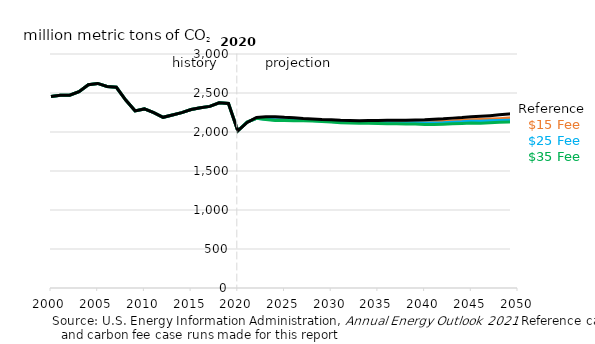
| Category | $15 Fee case | $25 Fee case | $35 Fee case | Reference |
|---|---|---|---|---|
| 2000.0 | 2454.069 | 2454.069 | 2454.069 | 2454.069 |
| 2001.0 | 2472.441 | 2472.441 | 2472.441 | 2472.441 |
| 2002.0 | 2470.83 | 2470.83 | 2470.83 | 2470.83 |
| 2003.0 | 2516.745 | 2516.745 | 2516.745 | 2516.745 |
| 2004.0 | 2606.407 | 2606.407 | 2606.407 | 2606.407 |
| 2005.0 | 2622.849 | 2622.849 | 2622.849 | 2622.849 |
| 2006.0 | 2584.14 | 2584.14 | 2584.14 | 2584.14 |
| 2007.0 | 2573.196 | 2573.196 | 2573.196 | 2573.196 |
| 2008.0 | 2409.604 | 2409.604 | 2409.604 | 2409.604 |
| 2009.0 | 2271.146 | 2271.146 | 2271.146 | 2271.146 |
| 2010.0 | 2295.762 | 2295.762 | 2295.762 | 2295.762 |
| 2011.0 | 2247.259 | 2247.259 | 2247.259 | 2247.259 |
| 2012.0 | 2188.587 | 2188.587 | 2188.587 | 2188.587 |
| 2013.0 | 2217.671 | 2217.671 | 2217.671 | 2217.671 |
| 2014.0 | 2248.549 | 2248.549 | 2248.549 | 2248.549 |
| 2015.0 | 2287.982 | 2287.982 | 2287.982 | 2287.982 |
| 2016.0 | 2310.666 | 2310.666 | 2310.666 | 2310.666 |
| 2017.0 | 2328.411 | 2328.411 | 2328.411 | 2328.411 |
| 2018.0 | 2374.002 | 2374.002 | 2374.002 | 2374.002 |
| 2019.0 | 2365.489 | 2365.489 | 2365.489 | 2365.489 |
| 2020.0 | 2015.744 | 2015.744 | 2015.744 | 2015.744 |
| 2021.0 | 2127.874 | 2127.786 | 2127.65 | 2122.328 |
| 2022.0 | 2175.002 | 2175.168 | 2175.106 | 2185.958 |
| 2023.0 | 2170.787 | 2164.372 | 2160.342 | 2195.964 |
| 2024.0 | 2165.831 | 2155.655 | 2147.424 | 2194.754 |
| 2025.0 | 2166.704 | 2155.946 | 2148.027 | 2187.734 |
| 2026.0 | 2164.525 | 2153.545 | 2144.878 | 2183.594 |
| 2027.0 | 2156.867 | 2151.086 | 2143.176 | 2173.197 |
| 2028.0 | 2156.392 | 2147.295 | 2140.345 | 2167.089 |
| 2029.0 | 2149.59 | 2141.006 | 2134.43 | 2159.925 |
| 2030.0 | 2141.881 | 2134.381 | 2126.702 | 2158.208 |
| 2031.0 | 2134.595 | 2126.627 | 2118.56 | 2149.872 |
| 2032.0 | 2131.5 | 2122.878 | 2115.114 | 2146.393 |
| 2033.0 | 2128.844 | 2120.755 | 2111.945 | 2144.871 |
| 2034.0 | 2129.276 | 2120.922 | 2110.966 | 2146.858 |
| 2035.0 | 2129.339 | 2120.011 | 2109.254 | 2148.657 |
| 2036.0 | 2128.284 | 2117.799 | 2106.401 | 2149.552 |
| 2037.0 | 2128.712 | 2115.913 | 2104.529 | 2150.615 |
| 2038.0 | 2128.641 | 2115.48 | 2102.796 | 2152.097 |
| 2039.0 | 2130.729 | 2117.649 | 2101.126 | 2155.192 |
| 2040.0 | 2128.878 | 2115.993 | 2097.397 | 2157.782 |
| 2041.0 | 2133.106 | 2116.245 | 2096.615 | 2164.212 |
| 2042.0 | 2138.802 | 2119.373 | 2099.955 | 2169.441 |
| 2043.0 | 2144.405 | 2125.295 | 2104.843 | 2177.895 |
| 2044.0 | 2149.969 | 2129.892 | 2109.433 | 2185.242 |
| 2045.0 | 2156.49 | 2137.489 | 2114.826 | 2195.333 |
| 2046.0 | 2161.274 | 2139.127 | 2113.624 | 2201.795 |
| 2047.0 | 2165.836 | 2143.688 | 2117.877 | 2209.764 |
| 2048.0 | 2171.421 | 2147.68 | 2124.713 | 2219.877 |
| 2049.0 | 2178.184 | 2151.683 | 2128.811 | 2229.586 |
| 2050.0 | 2185.48 | 2157.24 | 2134.851 | 2240.57 |